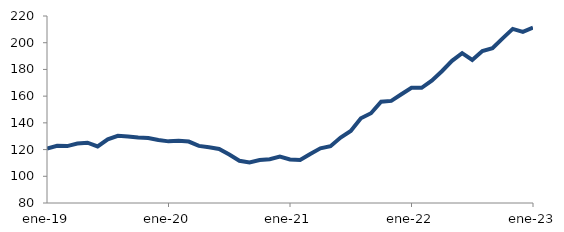
| Category | Series 0 |
|---|---|
| 2019-01-01 | 120.689 |
| 2019-02-01 | 122.792 |
| 2019-03-01 | 122.605 |
| 2019-04-01 | 124.541 |
| 2019-05-01 | 125.115 |
| 2019-06-01 | 122.365 |
| 2019-07-01 | 127.653 |
| 2019-08-01 | 130.323 |
| 2019-09-01 | 129.814 |
| 2019-10-01 | 129.013 |
| 2019-11-01 | 128.663 |
| 2019-12-01 | 127.192 |
| 2020-01-01 | 126.144 |
| 2020-02-01 | 126.638 |
| 2020-03-01 | 125.992 |
| 2020-04-01 | 122.726 |
| 2020-05-01 | 121.669 |
| 2020-06-01 | 120.485 |
| 2020-07-01 | 116.268 |
| 2020-08-01 | 111.597 |
| 2020-09-01 | 110.39 |
| 2020-10-01 | 112.229 |
| 2020-11-01 | 112.769 |
| 2020-12-01 | 114.741 |
| 2021-01-01 | 112.625 |
| 2021-02-01 | 112.14 |
| 2021-03-01 | 116.74 |
| 2021-04-01 | 120.911 |
| 2021-05-01 | 122.536 |
| 2021-06-01 | 128.968 |
| 2021-07-01 | 133.864 |
| 2021-08-01 | 143.384 |
| 2021-09-01 | 147.196 |
| 2021-10-01 | 155.883 |
| 2021-11-01 | 156.426 |
| 2021-12-01 | 161.4 |
| 2022-01-01 | 166.276 |
| 2022-02-01 | 166.219 |
| 2022-03-01 | 171.531 |
| 2022-04-01 | 178.644 |
| 2022-05-01 | 186.465 |
| 2022-06-01 | 192.187 |
| 2022-07-01 | 187.044 |
| 2022-08-01 | 193.806 |
| 2022-09-01 | 195.846 |
| 2022-10-01 | 203.287 |
| 2022-11-01 | 210.344 |
| 2022-12-01 | 208.16 |
| 2023-01-01 | 211.29 |